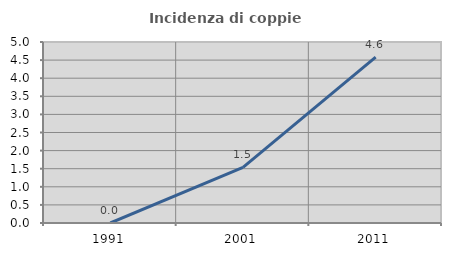
| Category | Incidenza di coppie miste |
|---|---|
| 1991.0 | 0 |
| 2001.0 | 1.538 |
| 2011.0 | 4.582 |